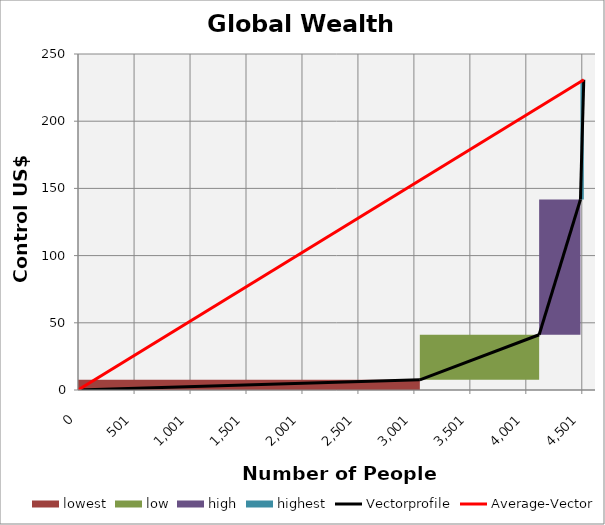
| Category | transparent | lowest | low | high | highest | Border right & top |
|---|---|---|---|---|---|---|
| 0.0 | 0 | 7.6 | 0 | 0 | 0 | 0 |
| 3054.0 | 0 | 7.6 | 0 | 0 | 0 | 0 |
| 3054.0 | 7.6 | 0 | 33.5 | 0 | 0 | 0 |
| 4120.0 | 7.6 | 0 | 33.5 | 0 | 0 | 0 |
| 4120.0 | 41.1 | 0 | 0 | 100.6 | 0 | 0 |
| 4489.0 | 41.1 | 0 | 0 | 100.6 | 0 | 0 |
| 4489.0 | 141.7 | 0 | 0 | 0 | 89.1 | 0 |
| 4518.7 | 141.7 | 0 | 0 | 0 | 89.1 | 0 |
| 4518.7 | 230.8 | 0 | 0 | 0 | 0 | 0 |
| 4518.7 | 230.8 | 0 | 0 | 0 | 0 | 0 |
| 4518.7 | 230.8 | 0 | 0 | 0 | 0 | 0 |
| 4518.7 | 230.8 | 0 | 0 | 0 | 0 | 0 |
| 4518.7 | 230.8 | 0 | 0 | 0 | 0 | 0 |
| 4518.7 | 230.8 | 0 | 0 | 0 | 0 | 0 |
| 4518.7 | 230.8 | 0 | 0 | 0 | 0 | 0 |
| 4518.7 | 230.8 | 0 | 0 | 0 | 0 | 0 |
| 4518.7 | 230.8 | 0 | 0 | 0 | 0 | 0 |
| 4518.7 | 230.8 | 0 | 0 | 0 | 0 | 0 |
| 4518.7 | 230.8 | 0 | 0 | 0 | 0 | 0 |
| 4518.7 | 230.8 | 0 | 0 | 0 | 0 | 0 |
| 4518.7 | 230.8 | 0 | 0 | 0 | 0 | 0 |
| 4618.7 | 230.8 | 0 | 0 | 0 | 0 | 0 |
| 4618.7 | 230.8 | 0 | 0 | 0 | 0 | 0 |